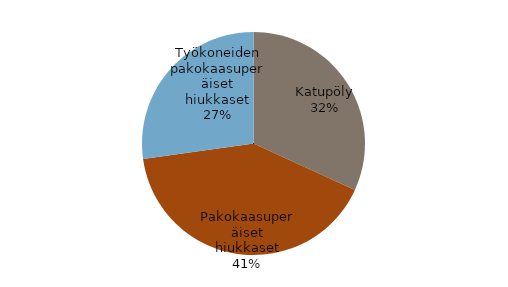
| Category | Koko maa* |
|---|---|
| Katupöly | 0.209 |
| Pakokaasuperäiset hiukkaset | 0.269 |
| Työkoneiden pakokaasuperäiset hiukkaset | 0.179 |